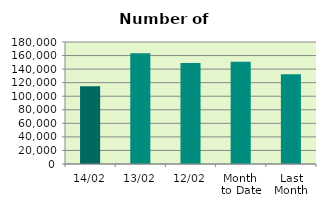
| Category | Series 0 |
|---|---|
| 14/02 | 114814 |
| 13/02 | 163518 |
| 12/02 | 148972 |
| Month 
to Date | 150740.2 |
| Last
Month | 132423.636 |